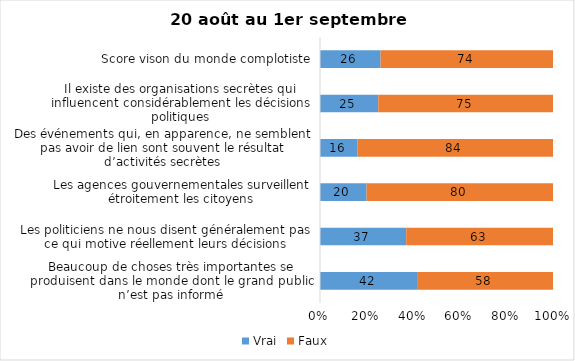
| Category | Vrai | Faux |
|---|---|---|
| Beaucoup de choses très importantes se produisent dans le monde dont le grand public n’est pas informé | 42 | 58 |
| Les politiciens ne nous disent généralement pas ce qui motive réellement leurs décisions | 37 | 63 |
| Les agences gouvernementales surveillent étroitement les citoyens | 20 | 80 |
| Des événements qui, en apparence, ne semblent pas avoir de lien sont souvent le résultat d’activités secrètes | 16 | 84 |
| Il existe des organisations secrètes qui influencent considérablement les décisions politiques | 25 | 75 |
| Score vison du monde complotiste | 26 | 74 |